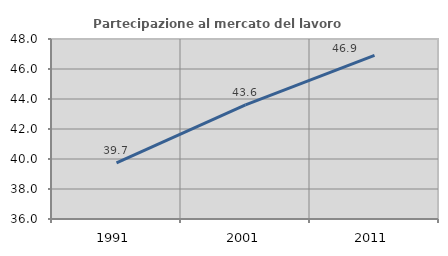
| Category | Partecipazione al mercato del lavoro  femminile |
|---|---|
| 1991.0 | 39.744 |
| 2001.0 | 43.603 |
| 2011.0 | 46.907 |